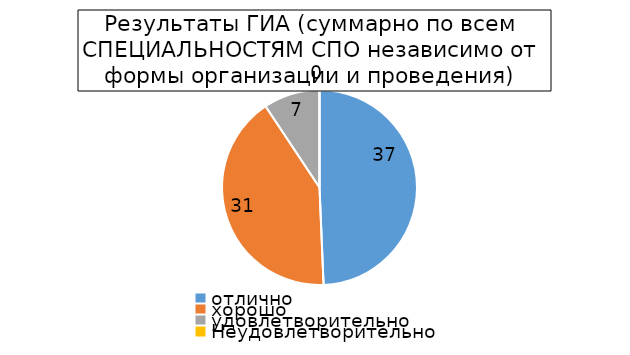
| Category | Series 1 |
|---|---|
| отлично | 37 |
| хорошо | 31 |
| удовлетворительно  | 7 |
| Неудовлетворительно  | 0 |